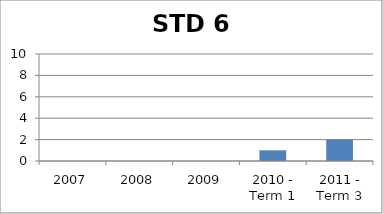
| Category | Rank |
|---|---|
| 2007 | 0 |
| 2008 | 0 |
| 2009 | 0 |
| 2010 - Term 1 | 1 |
| 2011 - Term 3 | 2 |